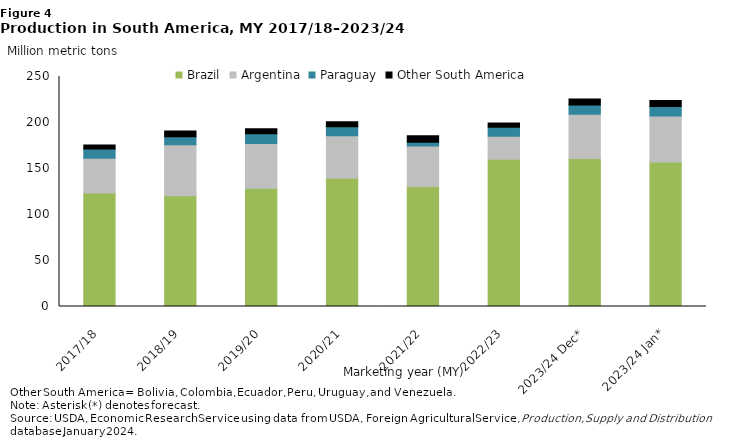
| Category | Brazil | Argentina | Paraguay | Other South America |
|---|---|---|---|---|
| 2017/18 | 123.4 | 37.8 | 9.906 | 4.562 |
| 2018/19 | 120.5 | 55.3 | 8.844 | 6.232 |
| 2019/20 | 128.5 | 48.8 | 10.553 | 5.391 |
| 2020/21 | 139.5 | 46.2 | 9.642 | 5.525 |
| 2021/22 | 130.5 | 43.9 | 4.183 | 6.898 |
| 2022/23 | 160 | 25 | 9.75 | 4.572 |
| 2023/24 Dec* | 161 | 48 | 10 | 6.417 |
| 2023/24 Jan* | 157 | 50 | 10.3 | 6.517 |